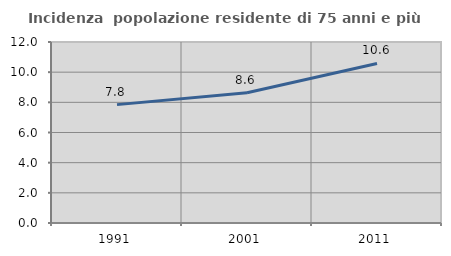
| Category | Incidenza  popolazione residente di 75 anni e più |
|---|---|
| 1991.0 | 7.848 |
| 2001.0 | 8.632 |
| 2011.0 | 10.579 |